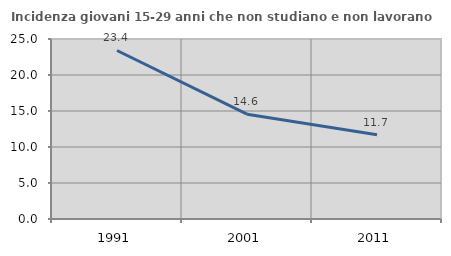
| Category | Incidenza giovani 15-29 anni che non studiano e non lavorano  |
|---|---|
| 1991.0 | 23.404 |
| 2001.0 | 14.563 |
| 2011.0 | 11.702 |